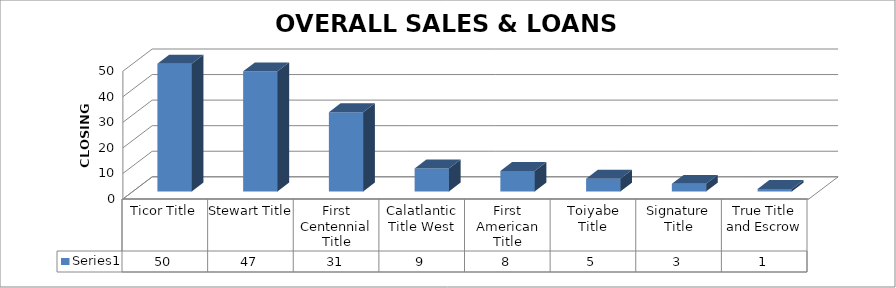
| Category | Series 0 |
|---|---|
| Ticor Title | 50 |
| Stewart Title | 47 |
| First Centennial Title | 31 |
| Calatlantic Title West | 9 |
| First American Title | 8 |
| Toiyabe Title | 5 |
| Signature Title | 3 |
| True Title and Escrow | 1 |